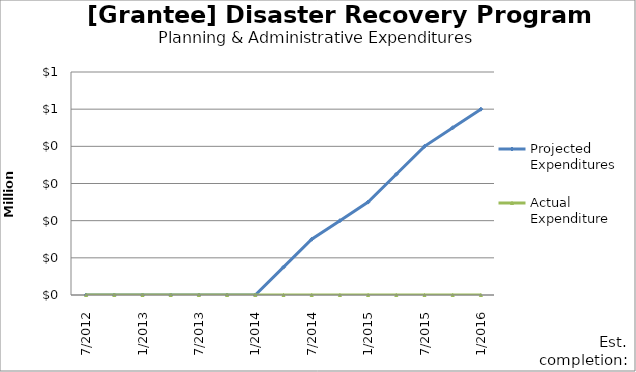
| Category | Projected Expenditures | Actual Expenditure |
|---|---|---|
| 7/2012 | 0 | 0 |
| 10/2012 | 0 | 0 |
| 1/2013 | 0 | 0 |
| 4/2013 | 0 | 0 |
| 7/2013 | 0 | 0 |
| 10/2013 | 0 | 0 |
| 1/2014 | 0 | 0 |
| 4/2014 | 75000 | 0 |
| 7/2014 | 150000 | 0 |
| 10/2014 | 200000 | 0 |
| 1/2015 | 250000 | 0 |
| 4/2015 | 325000 | 0 |
| 7/2015 | 400000 | 0 |
| 10/2015 | 450000 | 0 |
| 1/2016 | 500000 | 0 |